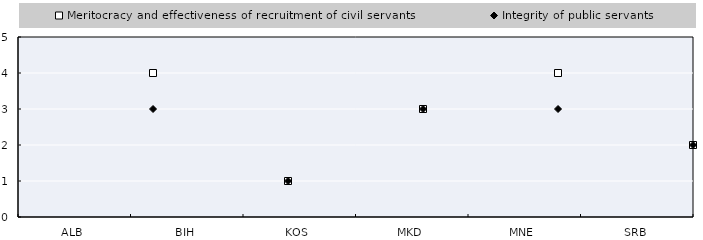
| Category | Average score for Policy Development and Co-ordination Sub-dimension |
|---|---|
| ALB | 1.8 |
| BIH | 0.4 |
| KOS | 2 |
| MKD | 1.2 |
| MNE | 3 |
| SRB | 2.6 |